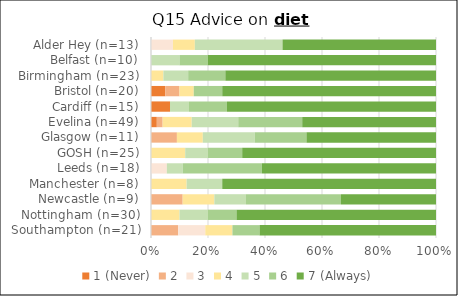
| Category | 1 (Never) | 2 | 3 | 4 | 5 | 6 | 7 (Always) |
|---|---|---|---|---|---|---|---|
| Southampton (n=21) | 0 | 2 | 2 | 2 | 0 | 2 | 13 |
| Nottingham (n=30) | 0 | 0 | 0 | 3 | 3 | 3 | 21 |
| Newcastle (n=9) | 0 | 1 | 0 | 1 | 1 | 3 | 3 |
| Manchester (n=8) | 0 | 0 | 0 | 1 | 1 | 0 | 6 |
| Leeds (n=18) | 0 | 0 | 1 | 0 | 1 | 5 | 11 |
| GOSH (n=25) | 0 | 0 | 0 | 3 | 2 | 3 | 17 |
| Glasgow (n=11) | 0 | 1 | 0 | 1 | 2 | 2 | 5 |
| Evelina (n=49) | 1 | 1 | 0 | 5 | 8 | 11 | 23 |
| Cardiff (n=15) | 1 | 0 | 0 | 0 | 1 | 2 | 11 |
| Bristol (n=20) | 1 | 1 | 0 | 1 | 0 | 2 | 15 |
| Birmingham (n=23) | 0 | 0 | 0 | 1 | 2 | 3 | 17 |
| Belfast (n=10) | 0 | 0 | 0 | 0 | 1 | 1 | 8 |
| Alder Hey (n=13) | 0 | 0 | 1 | 1 | 4 | 0 | 7 |